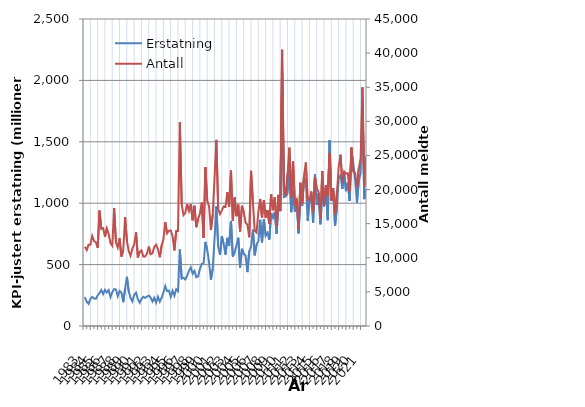
| Category | Erstatning |
|---|---|
| 1983.0 | 235.159 |
| nan | 196.982 |
| nan | 180.14 |
| nan | 220.664 |
| 1984.0 | 236.624 |
| nan | 223.829 |
| nan | 221.923 |
| nan | 248.222 |
| 1985.0 | 268.237 |
| nan | 293.19 |
| nan | 259.801 |
| nan | 294.649 |
| 1986.0 | 273.185 |
| nan | 292.32 |
| nan | 235.278 |
| nan | 275.329 |
| 1987.0 | 300.792 |
| nan | 296.826 |
| nan | 242.905 |
| nan | 285.785 |
| 1988.0 | 272.01 |
| nan | 193.901 |
| nan | 302.006 |
| nan | 400.073 |
| 1989.0 | 282.643 |
| nan | 228.443 |
| nan | 201.011 |
| nan | 253.597 |
| 1990.0 | 271.536 |
| nan | 218.451 |
| nan | 189.456 |
| nan | 220.519 |
| 1991.0 | 237.961 |
| nan | 228.799 |
| nan | 239.453 |
| nan | 247.565 |
| 1992.0 | 231.271 |
| nan | 199.276 |
| nan | 230.258 |
| nan | 190.009 |
| 1993.0 | 238.409 |
| nan | 198.409 |
| nan | 229.227 |
| nan | 271.182 |
| 1994.0 | 324.8 |
| nan | 283.949 |
| nan | 288.489 |
| nan | 237.786 |
| 1995.0 | 286.483 |
| nan | 246.46 |
| nan | 299.475 |
| nan | 284.336 |
| 1996.0 | 623.548 |
| nan | 386.111 |
| nan | 393.009 |
| nan | 379.027 |
| 1997.0 | 410.33 |
| nan | 450.267 |
| nan | 476.838 |
| nan | 425.45 |
| 1998.0 | 448.839 |
| nan | 397.629 |
| nan | 404.125 |
| nan | 464.496 |
| 1999.0 | 506.632 |
| nan | 509.093 |
| nan | 685.049 |
| nan | 620.403 |
| 2000.0 | 517.147 |
| nan | 375.562 |
| nan | 465.591 |
| nan | 709.882 |
| 2001.0 | 974.232 |
| nan | 644.945 |
| nan | 579.247 |
| nan | 732.866 |
| 2002.0 | 667.462 |
| nan | 580.757 |
| nan | 717.716 |
| nan | 653.999 |
| 2003.0 | 855.341 |
| nan | 565.52 |
| nan | 601.642 |
| nan | 655.4 |
| 2004.0 | 719.01 |
| nan | 475.361 |
| nan | 628.446 |
| nan | 587.404 |
| 2005.0 | 574.925 |
| nan | 438.747 |
| nan | 609.1 |
| nan | 645.493 |
| 2006.0 | 784.607 |
| nan | 575.401 |
| nan | 662.07 |
| nan | 690.722 |
| 2007.0 | 864.576 |
| nan | 679.739 |
| nan | 868.481 |
| nan | 734.285 |
| 2008.0 | 759.346 |
| nan | 702.963 |
| nan | 918.111 |
| nan | 881.751 |
| 2009.0 | 925.299 |
| nan | 751.195 |
| nan | 992.309 |
| nan | 937.939 |
| 2010.0 | 2057.459 |
| nan | 1049.406 |
| nan | 1054.455 |
| nan | 1078.752 |
| 2011.0 | 1274.887 |
| nan | 927.068 |
| nan | 1105.387 |
| nan | 931.58 |
| 2012.0 | 1032.063 |
| nan | 754.533 |
| nan | 1040.289 |
| nan | 979.531 |
| 2013.0 | 1202.967 |
| nan | 1177.931 |
| nan | 857.117 |
| nan | 1035.297 |
| 2014.0 | 1021.082 |
| nan | 838.51 |
| nan | 1233.492 |
| nan | 986.251 |
| 2015.0 | 1082.045 |
| nan | 828.657 |
| nan | 1096.905 |
| nan | 973.926 |
| 2016.0 | 1119.605 |
| nan | 861.802 |
| nan | 1511.447 |
| nan | 1025.517 |
| 2017.0 | 1099.34 |
| nan | 815.353 |
| nan | 962.941 |
| nan | 1202.394 |
| 2018.0 | 1227.471 |
| nan | 1116.671 |
| nan | 1244.702 |
| nan | 1098.191 |
| 2019.0 | 1168.183 |
| nan | 1018.571 |
| nan | 1417.623 |
| nan | 1320.203 |
| 2020.0 | 1193.609 |
| nan | 1002.629 |
| nan | 1183.367 |
| nan | 1243.847 |
| 2021.0 | 1833.902 |
| nan | 1033.05 |
| nan | 1111.153 |